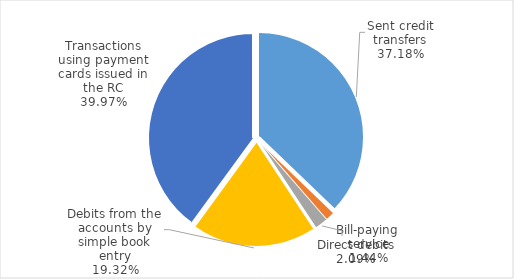
| Category | Total |
|---|---|
| Sent credit transfers | 353354731 |
| Bill-paying service | 13699655 |
| Direct debits | 19890023 |
| Debits from the accounts by simple book entry | 183589150 |
| Transactions using payment cards issued in the RC | 379811158 |